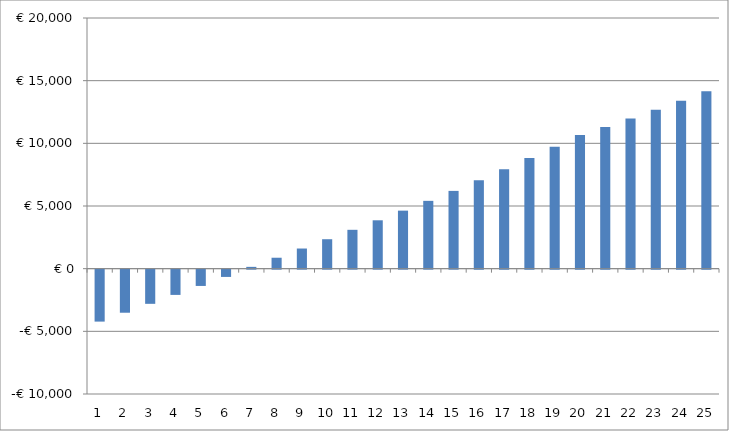
| Category | Series 0 |
|---|---|
| 0 | -4143.8 |
| 1 | -3435.614 |
| 2 | -2725.805 |
| 3 | -2013.703 |
| 4 | -1298.599 |
| 5 | -579.746 |
| 6 | 143.648 |
| 7 | 872.418 |
| 8 | 1607.447 |
| 9 | 2349.668 |
| 10 | 3100.07 |
| 11 | 3859.697 |
| 12 | 4629.653 |
| 13 | 5411.11 |
| 14 | 6205.305 |
| 15 | 7063.548 |
| 16 | 7937.229 |
| 17 | 8827.816 |
| 18 | 9736.867 |
| 19 | 10666.031 |
| 20 | 11311.767 |
| 21 | 11980.859 |
| 22 | 12675.21 |
| 23 | 13396.837 |
| 24 | 14147.885 |